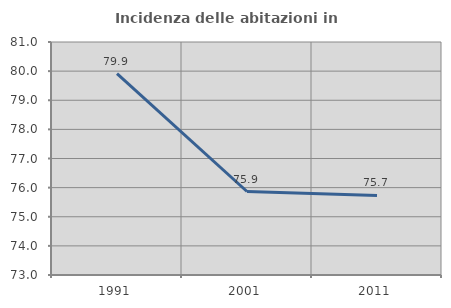
| Category | Incidenza delle abitazioni in proprietà  |
|---|---|
| 1991.0 | 79.911 |
| 2001.0 | 75.867 |
| 2011.0 | 75.731 |